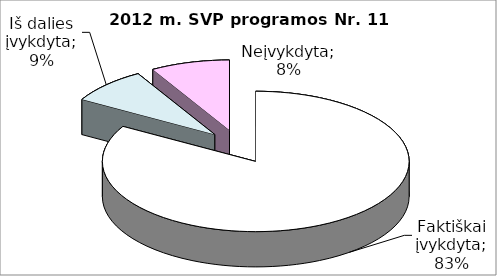
| Category | Series 0 |
|---|---|
|  | 10 |
|  | 1 |
|  | 1 |